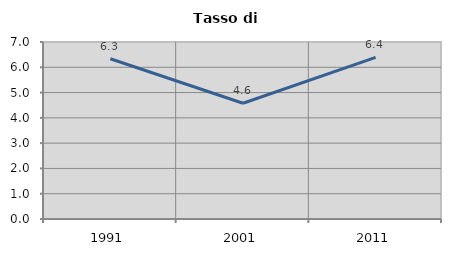
| Category | Tasso di disoccupazione   |
|---|---|
| 1991.0 | 6.337 |
| 2001.0 | 4.577 |
| 2011.0 | 6.391 |